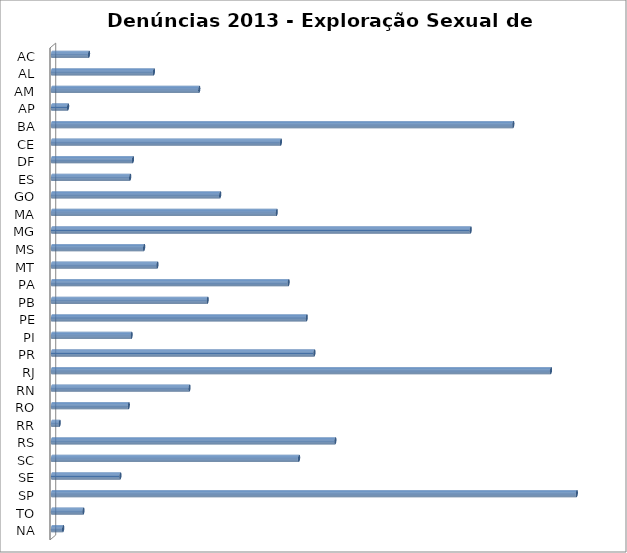
| Category | Series 0 |
|---|---|
| AC | 53 |
| AL | 146 |
| AM | 211 |
| AP | 23 |
| BA | 661 |
| CE | 328 |
| DF | 116 |
| ES | 112 |
| GO | 241 |
| MA | 322 |
| MG | 600 |
| MS | 132 |
| MT | 151 |
| PA | 339 |
| PB | 223 |
| PE | 365 |
| PI | 114 |
| PR | 376 |
| RJ | 715 |
| RN | 197 |
| RO | 110 |
| RR | 11 |
| RS | 406 |
| SC | 354 |
| SE | 98 |
| SP | 752 |
| TO | 45 |
| NA | 16 |